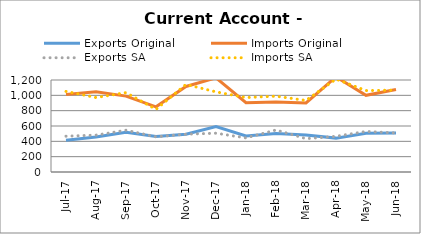
| Category | Exports Original | Imports Original | Exports SA | Imports SA |
|---|---|---|---|---|
| 2017-07-11 | 415 | 1011 | 467 | 1051 |
| 2017-08-11 | 457 | 1047 | 481 | 971 |
| 2017-09-11 | 518 | 990 | 545 | 1035 |
| 2017-10-11 | 463 | 850 | 459 | 817 |
| 2017-11-11 | 492 | 1116 | 493 | 1142 |
| 2017-12-11 | 593 | 1228 | 506 | 1045 |
| 2018-01-11 | 470 | 904 | 445 | 971 |
| 2018-02-11 | 503 | 913 | 548 | 989 |
| 2018-03-11 | 483 | 900 | 435 | 933 |
| 2018-04-11 | 442 | 1241 | 465 | 1212 |
| 2018-05-11 | 506 | 1000 | 529 | 1062 |
| 2018-06-11 | 509 | 1077 | 509 | 1068 |